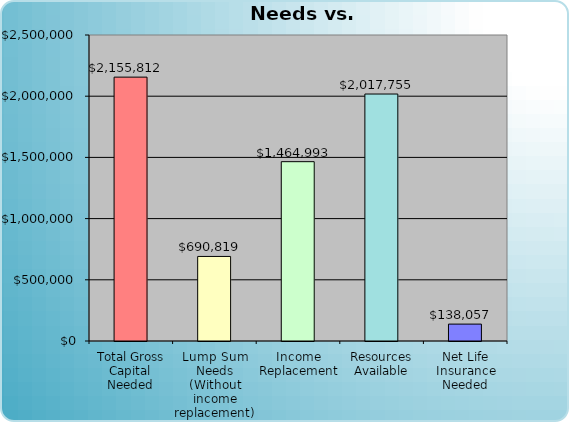
| Category | Series 0 |
|---|---|
| Total Gross Capital Needed | 2155811.974 |
| Lump Sum Needs (Without income replacement) | 690818.72 |
| Income Replacement | 1464993.254 |
| Resources Available | 2017755 |
| Net Life Insurance Needed | 138056.974 |